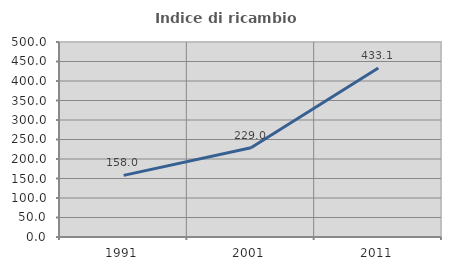
| Category | Indice di ricambio occupazionale  |
|---|---|
| 1991.0 | 157.96 |
| 2001.0 | 228.953 |
| 2011.0 | 433.083 |